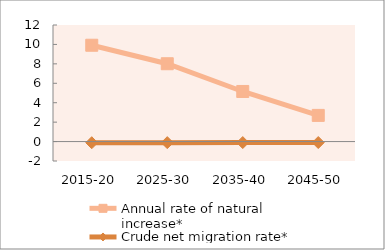
| Category | Annual rate of natural increase* | Crude net migration rate* |
|---|---|---|
| 2015-20 | 9.916 | -0.119 |
| 2025-30 | 8.012 | -0.109 |
| 2035-40 | 5.157 | -0.102 |
| 2045-50 | 2.694 | -0.098 |